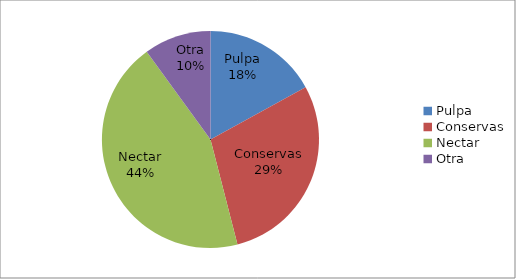
| Category | Series 0 |
|---|---|
| Pulpa | 47.6 |
| Conservas | 81.2 |
| Nectar | 123.2 |
| Otra | 28 |